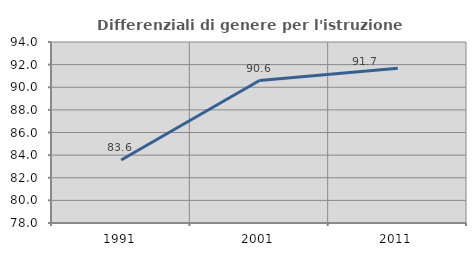
| Category | Differenziali di genere per l'istruzione superiore |
|---|---|
| 1991.0 | 83.57 |
| 2001.0 | 90.594 |
| 2011.0 | 91.685 |